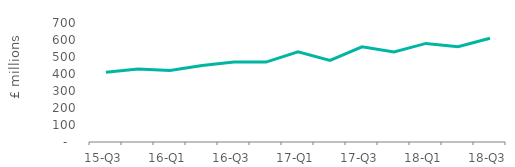
| Category | Full market |
|---|---|
| 15-Q3 | 410 |
| 15-Q4 | 430 |
| 16-Q1 | 420 |
| 16-Q2 | 450 |
| 16-Q3 | 470 |
| 16-Q4 | 470 |
| 17-Q1 | 530 |
| 17-Q2 | 480 |
| 17-Q3 | 560 |
| 17-Q4 | 530 |
| 18-Q1 | 580 |
| 18-Q2 | 560 |
| 18-Q3 | 610 |